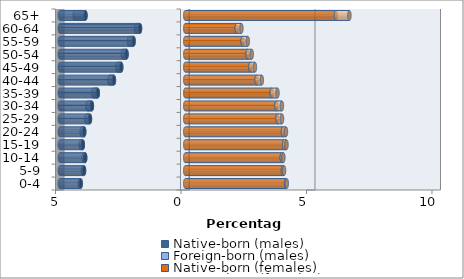
| Category | Native-born (males) | Foreign-born (males) | Native-born (females) | Foreign-born (females) |
|---|---|---|---|---|
| 0-4 | -4.165 | -0.031 | 4.014 | 0.031 |
| 5-9 | -4.033 | -0.047 | 3.887 | 0.048 |
| 10-14 | -3.986 | -0.06 | 3.845 | 0.064 |
| 15-19 | -4.081 | -0.082 | 3.94 | 0.093 |
| 20-24 | -4.025 | -0.102 | 3.891 | 0.122 |
| 25-29 | -3.796 | -0.147 | 3.675 | 0.18 |
| 30-34 | -3.719 | -0.177 | 3.634 | 0.217 |
| 35-39 | -3.483 | -0.188 | 3.447 | 0.228 |
| 40-44 | -2.842 | -0.175 | 2.842 | 0.209 |
| 45-49 | -2.55 | -0.157 | 2.595 | 0.182 |
| 50-54 | -2.339 | -0.148 | 2.485 | 0.165 |
| 55-59 | -2.057 | -0.185 | 2.289 | 0.203 |
| 60-64 | -1.802 | -0.159 | 2.052 | 0.185 |
| 65+ | -3.974 | -0.429 | 6.005 | 0.535 |